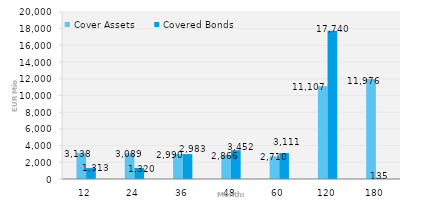
| Category | Cover Assets | Covered Bonds |
|---|---|---|
| 12.0 | 3137.608 | 1313.144 |
| 24.0 | 3089.319 | 1320 |
| 36.0 | 2990.453 | 2983 |
| 48.0 | 2865.679 | 3452 |
| 60.0 | 2709.765 | 3111 |
| 120.0 | 11106.507 | 17740 |
| 180.0 | 11975.995 | 135 |